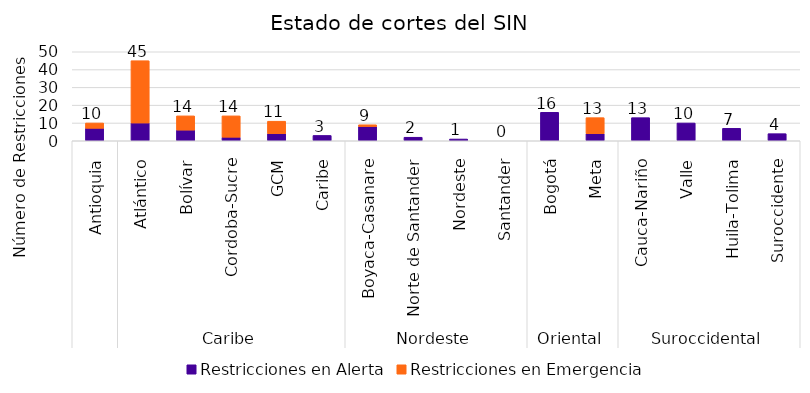
| Category | Restricciones en Alerta | Restricciones en Emergencia | Aux |
|---|---|---|---|
| 0 | 7 | 3 | 0 |
| 1 | 10 | 35 | 0 |
| 2 | 6 | 8 | 0 |
| 3 | 2 | 12 | 0 |
| 4 | 4 | 7 | 0 |
| 5 | 3 | 0 | 0 |
| 6 | 8 | 1 | 0 |
| 7 | 2 | 0 | 0 |
| 8 | 1 | 0 | 0 |
| 9 | 0 | 0 | 0 |
| 10 | 16 | 0 | 0 |
| 11 | 4 | 9 | 0 |
| 12 | 13 | 0 | 0 |
| 13 | 10 | 0 | 0 |
| 14 | 7 | 0 | 0 |
| 15 | 4 | 0 | 0 |